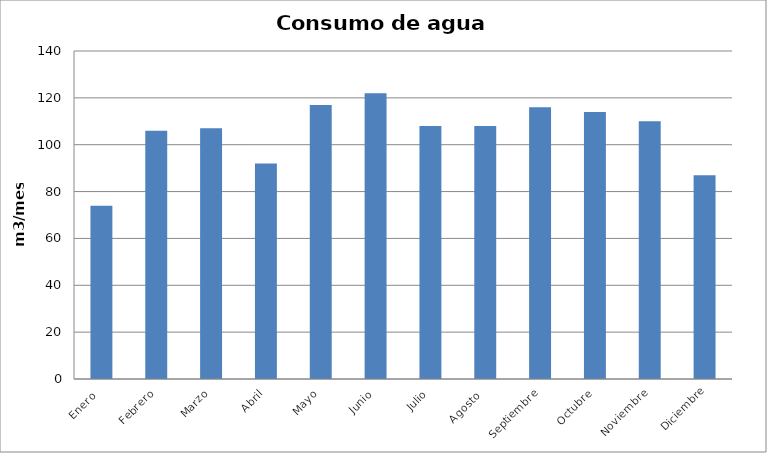
| Category | Series 0 |
|---|---|
| Enero  | 74 |
| Febrero | 106 |
| Marzo | 107 |
| Abril | 92 |
| Mayo | 117 |
| Junio | 122 |
| Julio | 108 |
| Agosto  | 108 |
| Septiembre | 116 |
| Octubre | 114 |
| Noviembre | 110 |
| Diciembre | 87 |